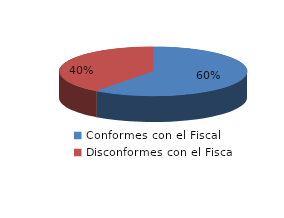
| Category | Series 0 |
|---|---|
| 0 | 118 |
| 1 | 78 |